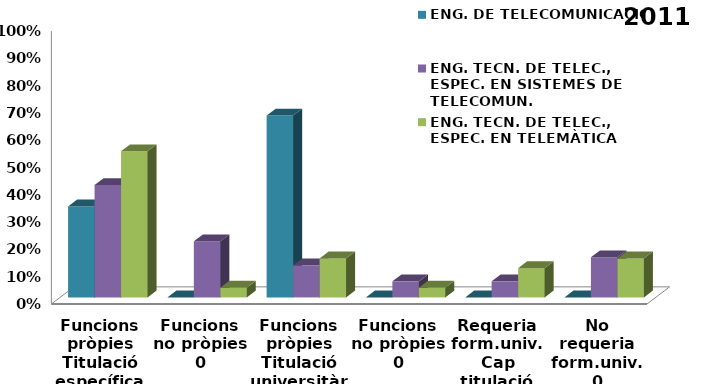
| Category | ENG. DE TELECOMUNICACIÓ | ENG. TECN. DE TELEC., ESPEC. EN SISTEMES DE TELECOMUN. | ENG. TECN. DE TELEC., ESPEC. EN TELEMÀTICA |
|---|---|---|---|
| 0 | 0.333 | 0.412 | 0.536 |
| 1 | 0 | 0.206 | 0.036 |
| 2 | 0.667 | 0.118 | 0.143 |
| 3 | 0 | 0.059 | 0.036 |
| 4 | 0 | 0.059 | 0.107 |
| 5 | 0 | 0.147 | 0.143 |